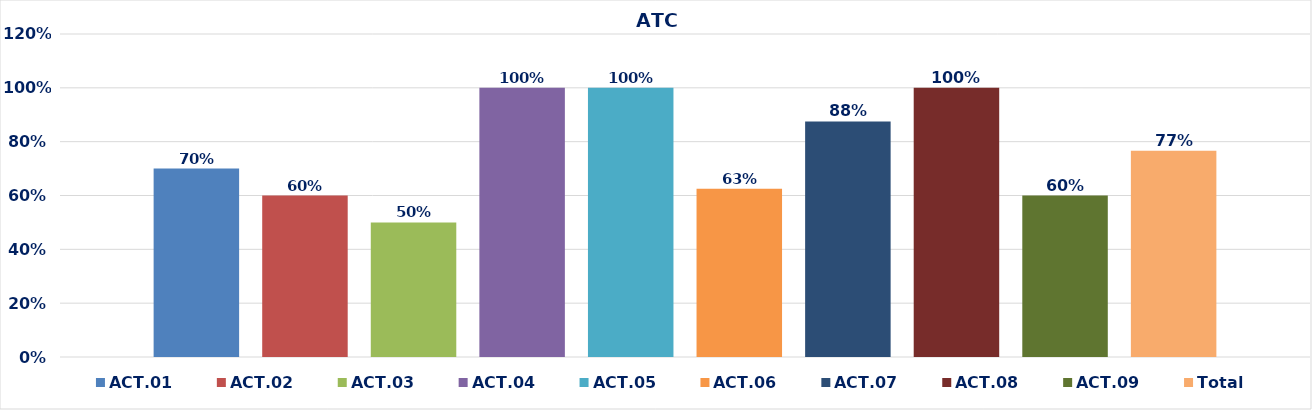
| Category | ACT.01 | ACT.02 | ACT.03 | ACT.04 | ACT.05 | ACT.06 | ACT.07 | ACT.08 | ACT.09 | Total |
|---|---|---|---|---|---|---|---|---|---|---|
| 0 | 0.7 | 0.6 | 0.5 | 1 | 1 | 0.625 | 0.875 | 1 | 0.6 | 0.767 |